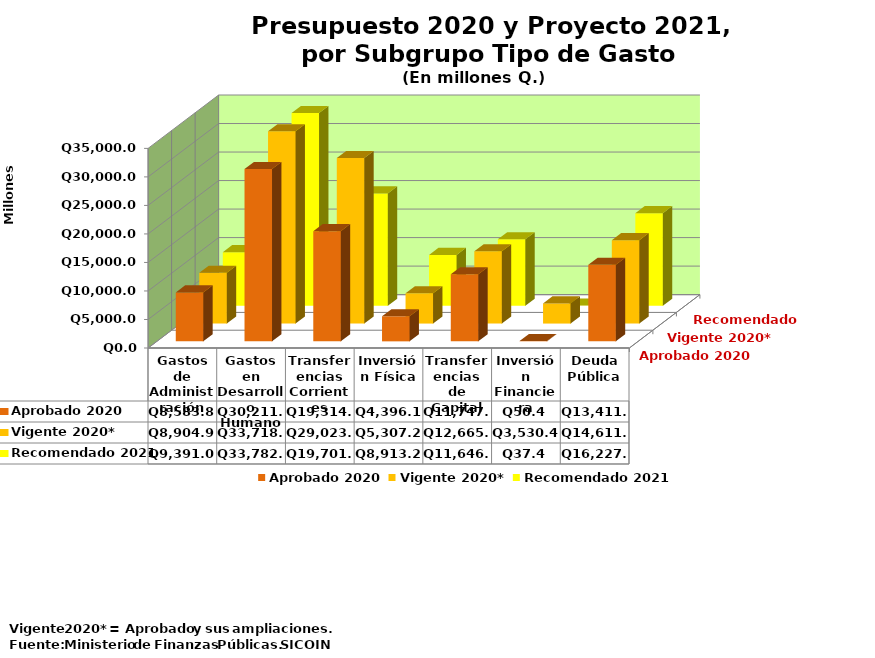
| Category | Aprobado 2020 | Vigente 2020* | Recomendado 2021 |
|---|---|---|---|
| Gastos de Administración | 8583.8 | 8904.9 | 9391 |
| Gastos en Desarrollo Humano | 30211.5 | 33718.8 | 33782.8 |
| Transferencias Corrientes | 19314.9 | 29023.1 | 19701.8 |
| Inversión Física | 4396.1 | 5307.2 | 8913.2 |
| Transferencias de Capital | 11747.3 | 12665.3 | 11646.5 |
| Inversión Financiera | 50.4 | 3530.4 | 37.4 |
| Deuda Pública | 13411 | 14611 | 16227.3 |